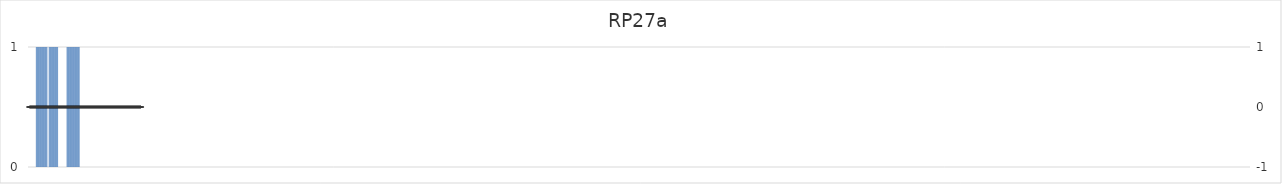
| Category | RP27a |
|---|---|
| 1.0 | 0 |
| 2.0 | 0 |
| 3.0 | 0 |
| 4.0 | 0 |
| 5.0 | 0 |
| 6.0 | 0 |
| 7.0 | 0 |
| 8.0 | 0 |
| 9.0 | 0 |
| 10.0 | 0 |
| 11.0 | 0 |
| 12.0 | 1 |
| 13.0 | 1 |
| 14.0 | 1 |
| 15.0 | 1 |
| 16.0 | 1 |
| 17.0 | 1 |
| 18.0 | 1 |
| 19.0 | 1 |
| 20.0 | 1 |
| 21.0 | 1 |
| 22.0 | 1 |
| 23.0 | 1 |
| 24.0 | 1 |
| 25.0 | 1 |
| 26.0 | 1 |
| 27.0 | 1 |
| 28.0 | 0 |
| 29.0 | 0 |
| 30.0 | 1 |
| 31.0 | 1 |
| 32.0 | 1 |
| 33.0 | 1 |
| 34.0 | 1 |
| 35.0 | 1 |
| 36.0 | 1 |
| 37.0 | 1 |
| 38.0 | 1 |
| 39.0 | 1 |
| 40.0 | 1 |
| 41.0 | 1 |
| 42.0 | 1 |
| 43.0 | 0 |
| 44.0 | 0 |
| 45.0 | 0 |
| 46.0 | 0 |
| 47.0 | 0 |
| 48.0 | 0 |
| 49.0 | 0 |
| 50.0 | 0 |
| 51.0 | 0 |
| 52.0 | 0 |
| 53.0 | 0 |
| 54.0 | 0 |
| 55.0 | 1 |
| 56.0 | 1 |
| 57.0 | 1 |
| 58.0 | 1 |
| 59.0 | 1 |
| 60.0 | 1 |
| 61.0 | 1 |
| 62.0 | 1 |
| 63.0 | 1 |
| 64.0 | 1 |
| 65.0 | 1 |
| 66.0 | 1 |
| 67.0 | 1 |
| 68.0 | 1 |
| 69.0 | 1 |
| 70.0 | 1 |
| 71.0 | 1 |
| 72.0 | 1 |
| 73.0 | 0 |
| 74.0 | 0 |
| 75.0 | 0 |
| 76.0 | 0 |
| 77.0 | 0 |
| 78.0 | 0 |
| 79.0 | 0 |
| 80.0 | 0 |
| 81.0 | 0 |
| 82.0 | 0 |
| 83.0 | 0 |
| 84.0 | 0 |
| 85.0 | 0 |
| 86.0 | 0 |
| 87.0 | 0 |
| 88.0 | 0 |
| 89.0 | 0 |
| 90.0 | 0 |
| 91.0 | 0 |
| 92.0 | 0 |
| 93.0 | 0 |
| 94.0 | 0 |
| 95.0 | 0 |
| 96.0 | 0 |
| 97.0 | 0 |
| 98.0 | 0 |
| 99.0 | 0 |
| 100.0 | 0 |
| 101.0 | 0 |
| 102.0 | 0 |
| 103.0 | 0 |
| 104.0 | 0 |
| 105.0 | 0 |
| 106.0 | 0 |
| 107.0 | 0 |
| 108.0 | 0 |
| 109.0 | 0 |
| 110.0 | 0 |
| 111.0 | 0 |
| 112.0 | 0 |
| 113.0 | 0 |
| 114.0 | 0 |
| 115.0 | 0 |
| 116.0 | 0 |
| 117.0 | 0 |
| 118.0 | 0 |
| 119.0 | 0 |
| 120.0 | 0 |
| 121.0 | 0 |
| 122.0 | 0 |
| 123.0 | 0 |
| 124.0 | 0 |
| 125.0 | 0 |
| 126.0 | 0 |
| 127.0 | 0 |
| 128.0 | 0 |
| 129.0 | 0 |
| 130.0 | 0 |
| 131.0 | 0 |
| 132.0 | 0 |
| 133.0 | 0 |
| 134.0 | 0 |
| 135.0 | 0 |
| 136.0 | 0 |
| 137.0 | 0 |
| 138.0 | 0 |
| 139.0 | 0 |
| 140.0 | 0 |
| 141.0 | 0 |
| 142.0 | 0 |
| 143.0 | 0 |
| 144.0 | 0 |
| 145.0 | 0 |
| 146.0 | 0 |
| 147.0 | 0 |
| 148.0 | 0 |
| 149.0 | 0 |
| 150.0 | 0 |
| 151.0 | 0 |
| 152.0 | 0 |
| 153.0 | 0 |
| 154.0 | 0 |
| 155.0 | 0 |
| 156.0 | 0 |
| 157.0 | 0 |
| 158.0 | 0 |
| 159.0 | 0 |
| 160.0 | 0 |
| 161.0 | 0 |
| 162.0 | 0 |
| 163.0 | 0 |
| 164.0 | 0 |
| 165.0 | 0 |
| 166.0 | 0 |
| 167.0 | 0 |
| 168.0 | 0 |
| 169.0 | 0 |
| 170.0 | 0 |
| 171.0 | 0 |
| 172.0 | 0 |
| 173.0 | 0 |
| 174.0 | 0 |
| 175.0 | 0 |
| 176.0 | 0 |
| 177.0 | 0 |
| 178.0 | 0 |
| 179.0 | 0 |
| 180.0 | 0 |
| 181.0 | 0 |
| 182.0 | 0 |
| 183.0 | 0 |
| 184.0 | 0 |
| 185.0 | 0 |
| 186.0 | 0 |
| 187.0 | 0 |
| 188.0 | 0 |
| 189.0 | 0 |
| 190.0 | 0 |
| 191.0 | 0 |
| 192.0 | 0 |
| 193.0 | 0 |
| 194.0 | 0 |
| 195.0 | 0 |
| 196.0 | 0 |
| 197.0 | 0 |
| 198.0 | 0 |
| 199.0 | 0 |
| 200.0 | 0 |
| 201.0 | 0 |
| 202.0 | 0 |
| 203.0 | 0 |
| 204.0 | 0 |
| 205.0 | 0 |
| 206.0 | 0 |
| 207.0 | 0 |
| 208.0 | 0 |
| 209.0 | 0 |
| 210.0 | 0 |
| 211.0 | 0 |
| 212.0 | 0 |
| 213.0 | 0 |
| 214.0 | 0 |
| 215.0 | 0 |
| 216.0 | 0 |
| 217.0 | 0 |
| 218.0 | 0 |
| 219.0 | 0 |
| 220.0 | 0 |
| 221.0 | 0 |
| 222.0 | 0 |
| 223.0 | 0 |
| 224.0 | 0 |
| 225.0 | 0 |
| 226.0 | 0 |
| 227.0 | 0 |
| 228.0 | 0 |
| 229.0 | 0 |
| 230.0 | 0 |
| 231.0 | 0 |
| 232.0 | 0 |
| 233.0 | 0 |
| 234.0 | 0 |
| 235.0 | 0 |
| 236.0 | 0 |
| 237.0 | 0 |
| 238.0 | 0 |
| 239.0 | 0 |
| 240.0 | 0 |
| 241.0 | 0 |
| 242.0 | 0 |
| 243.0 | 0 |
| 244.0 | 0 |
| 245.0 | 0 |
| 246.0 | 0 |
| 247.0 | 0 |
| 248.0 | 0 |
| 249.0 | 0 |
| 250.0 | 0 |
| 251.0 | 0 |
| 252.0 | 0 |
| 253.0 | 0 |
| 254.0 | 0 |
| 255.0 | 0 |
| 256.0 | 0 |
| 257.0 | 0 |
| 258.0 | 0 |
| 259.0 | 0 |
| 260.0 | 0 |
| 261.0 | 0 |
| 262.0 | 0 |
| 263.0 | 0 |
| 264.0 | 0 |
| 265.0 | 0 |
| 266.0 | 0 |
| 267.0 | 0 |
| 268.0 | 0 |
| 269.0 | 0 |
| 270.0 | 0 |
| 271.0 | 0 |
| 272.0 | 0 |
| 273.0 | 0 |
| 274.0 | 0 |
| 275.0 | 0 |
| 276.0 | 0 |
| 277.0 | 0 |
| 278.0 | 0 |
| 279.0 | 0 |
| 280.0 | 0 |
| 281.0 | 0 |
| 282.0 | 0 |
| 283.0 | 0 |
| 284.0 | 0 |
| 285.0 | 0 |
| 286.0 | 0 |
| 287.0 | 0 |
| 288.0 | 0 |
| 289.0 | 0 |
| 290.0 | 0 |
| 291.0 | 0 |
| 292.0 | 0 |
| 293.0 | 0 |
| 294.0 | 0 |
| 295.0 | 0 |
| 296.0 | 0 |
| 297.0 | 0 |
| 298.0 | 0 |
| 299.0 | 0 |
| 300.0 | 0 |
| 301.0 | 0 |
| 302.0 | 0 |
| 303.0 | 0 |
| 304.0 | 0 |
| 305.0 | 0 |
| 306.0 | 0 |
| 307.0 | 0 |
| 308.0 | 0 |
| 309.0 | 0 |
| 310.0 | 0 |
| 311.0 | 0 |
| 312.0 | 0 |
| 313.0 | 0 |
| 314.0 | 0 |
| 315.0 | 0 |
| 316.0 | 0 |
| 317.0 | 0 |
| 318.0 | 0 |
| 319.0 | 0 |
| 320.0 | 0 |
| 321.0 | 0 |
| 322.0 | 0 |
| 323.0 | 0 |
| 324.0 | 0 |
| 325.0 | 0 |
| 326.0 | 0 |
| 327.0 | 0 |
| 328.0 | 0 |
| 329.0 | 0 |
| 330.0 | 0 |
| 331.0 | 0 |
| 332.0 | 0 |
| 333.0 | 0 |
| 334.0 | 0 |
| 335.0 | 0 |
| 336.0 | 0 |
| 337.0 | 0 |
| 338.0 | 0 |
| 339.0 | 0 |
| 340.0 | 0 |
| 341.0 | 0 |
| 342.0 | 0 |
| 343.0 | 0 |
| 344.0 | 0 |
| 345.0 | 0 |
| 346.0 | 0 |
| 347.0 | 0 |
| 348.0 | 0 |
| 349.0 | 0 |
| 350.0 | 0 |
| 351.0 | 0 |
| 352.0 | 0 |
| 353.0 | 0 |
| 354.0 | 0 |
| 355.0 | 0 |
| 356.0 | 0 |
| 357.0 | 0 |
| 358.0 | 0 |
| 359.0 | 0 |
| 360.0 | 0 |
| 361.0 | 0 |
| 362.0 | 0 |
| 363.0 | 0 |
| 364.0 | 0 |
| 365.0 | 0 |
| 366.0 | 0 |
| 367.0 | 0 |
| 368.0 | 0 |
| 369.0 | 0 |
| 370.0 | 0 |
| 371.0 | 0 |
| 372.0 | 0 |
| 373.0 | 0 |
| 374.0 | 0 |
| 375.0 | 0 |
| 376.0 | 0 |
| 377.0 | 0 |
| 378.0 | 0 |
| 379.0 | 0 |
| 380.0 | 0 |
| 381.0 | 0 |
| 382.0 | 0 |
| 383.0 | 0 |
| 384.0 | 0 |
| 385.0 | 0 |
| 386.0 | 0 |
| 387.0 | 0 |
| 388.0 | 0 |
| 389.0 | 0 |
| 390.0 | 0 |
| 391.0 | 0 |
| 392.0 | 0 |
| 393.0 | 0 |
| 394.0 | 0 |
| 395.0 | 0 |
| 396.0 | 0 |
| 397.0 | 0 |
| 398.0 | 0 |
| 399.0 | 0 |
| 400.0 | 0 |
| 401.0 | 0 |
| 402.0 | 0 |
| 403.0 | 0 |
| 404.0 | 0 |
| 405.0 | 0 |
| 406.0 | 0 |
| 407.0 | 0 |
| 408.0 | 0 |
| 409.0 | 0 |
| 410.0 | 0 |
| 411.0 | 0 |
| 412.0 | 0 |
| 413.0 | 0 |
| 414.0 | 0 |
| 415.0 | 0 |
| 416.0 | 0 |
| 417.0 | 0 |
| 418.0 | 0 |
| 419.0 | 0 |
| 420.0 | 0 |
| 421.0 | 0 |
| 422.0 | 0 |
| 423.0 | 0 |
| 424.0 | 0 |
| 425.0 | 0 |
| 426.0 | 0 |
| 427.0 | 0 |
| 428.0 | 0 |
| 429.0 | 0 |
| 430.0 | 0 |
| 431.0 | 0 |
| 432.0 | 0 |
| 433.0 | 0 |
| 434.0 | 0 |
| 435.0 | 0 |
| 436.0 | 0 |
| 437.0 | 0 |
| 438.0 | 0 |
| 439.0 | 0 |
| 440.0 | 0 |
| 441.0 | 0 |
| 442.0 | 0 |
| 443.0 | 0 |
| 444.0 | 0 |
| 445.0 | 0 |
| 446.0 | 0 |
| 447.0 | 0 |
| 448.0 | 0 |
| 449.0 | 0 |
| 450.0 | 0 |
| 451.0 | 0 |
| 452.0 | 0 |
| 453.0 | 0 |
| 454.0 | 0 |
| 455.0 | 0 |
| 456.0 | 0 |
| 457.0 | 0 |
| 458.0 | 0 |
| 459.0 | 0 |
| 460.0 | 0 |
| 461.0 | 0 |
| 462.0 | 0 |
| 463.0 | 0 |
| 464.0 | 0 |
| 465.0 | 0 |
| 466.0 | 0 |
| 467.0 | 0 |
| 468.0 | 0 |
| 469.0 | 0 |
| 470.0 | 0 |
| 471.0 | 0 |
| 472.0 | 0 |
| 473.0 | 0 |
| 474.0 | 0 |
| 475.0 | 0 |
| 476.0 | 0 |
| 477.0 | 0 |
| 478.0 | 0 |
| 479.0 | 0 |
| 480.0 | 0 |
| 481.0 | 0 |
| 482.0 | 0 |
| 483.0 | 0 |
| 484.0 | 0 |
| 485.0 | 0 |
| 486.0 | 0 |
| 487.0 | 0 |
| 488.0 | 0 |
| 489.0 | 0 |
| 490.0 | 0 |
| 491.0 | 0 |
| 492.0 | 0 |
| 493.0 | 0 |
| 494.0 | 0 |
| 495.0 | 0 |
| 496.0 | 0 |
| 497.0 | 0 |
| 498.0 | 0 |
| 499.0 | 0 |
| 500.0 | 0 |
| 501.0 | 0 |
| 502.0 | 0 |
| 503.0 | 0 |
| 504.0 | 0 |
| 505.0 | 0 |
| 506.0 | 0 |
| 507.0 | 0 |
| 508.0 | 0 |
| 509.0 | 0 |
| 510.0 | 0 |
| 511.0 | 0 |
| 512.0 | 0 |
| 513.0 | 0 |
| 514.0 | 0 |
| 515.0 | 0 |
| 516.0 | 0 |
| 517.0 | 0 |
| 518.0 | 0 |
| 519.0 | 0 |
| 520.0 | 0 |
| 521.0 | 0 |
| 522.0 | 0 |
| 523.0 | 0 |
| 524.0 | 0 |
| 525.0 | 0 |
| 526.0 | 0 |
| 527.0 | 0 |
| 528.0 | 0 |
| 529.0 | 0 |
| 530.0 | 0 |
| 531.0 | 0 |
| 532.0 | 0 |
| 533.0 | 0 |
| 534.0 | 0 |
| 535.0 | 0 |
| 536.0 | 0 |
| 537.0 | 0 |
| 538.0 | 0 |
| 539.0 | 0 |
| 540.0 | 0 |
| 541.0 | 0 |
| 542.0 | 0 |
| 543.0 | 0 |
| 544.0 | 0 |
| 545.0 | 0 |
| 546.0 | 0 |
| 547.0 | 0 |
| 548.0 | 0 |
| 549.0 | 0 |
| 550.0 | 0 |
| 551.0 | 0 |
| 552.0 | 0 |
| 553.0 | 0 |
| 554.0 | 0 |
| 555.0 | 0 |
| 556.0 | 0 |
| 557.0 | 0 |
| 558.0 | 0 |
| 559.0 | 0 |
| 560.0 | 0 |
| 561.0 | 0 |
| 562.0 | 0 |
| 563.0 | 0 |
| 564.0 | 0 |
| 565.0 | 0 |
| 566.0 | 0 |
| 567.0 | 0 |
| 568.0 | 0 |
| 569.0 | 0 |
| 570.0 | 0 |
| 571.0 | 0 |
| 572.0 | 0 |
| 573.0 | 0 |
| 574.0 | 0 |
| 575.0 | 0 |
| 576.0 | 0 |
| 577.0 | 0 |
| 578.0 | 0 |
| 579.0 | 0 |
| 580.0 | 0 |
| 581.0 | 0 |
| 582.0 | 0 |
| 583.0 | 0 |
| 584.0 | 0 |
| 585.0 | 0 |
| 586.0 | 0 |
| 587.0 | 0 |
| 588.0 | 0 |
| 589.0 | 0 |
| 590.0 | 0 |
| 591.0 | 0 |
| 592.0 | 0 |
| 593.0 | 0 |
| 594.0 | 0 |
| 595.0 | 0 |
| 596.0 | 0 |
| 597.0 | 0 |
| 598.0 | 0 |
| 599.0 | 0 |
| 600.0 | 0 |
| 601.0 | 0 |
| 602.0 | 0 |
| 603.0 | 0 |
| 604.0 | 0 |
| 605.0 | 0 |
| 606.0 | 0 |
| 607.0 | 0 |
| 608.0 | 0 |
| 609.0 | 0 |
| 610.0 | 0 |
| 611.0 | 0 |
| 612.0 | 0 |
| 613.0 | 0 |
| 614.0 | 0 |
| 615.0 | 0 |
| 616.0 | 0 |
| 617.0 | 0 |
| 618.0 | 0 |
| 619.0 | 0 |
| 620.0 | 0 |
| 621.0 | 0 |
| 622.0 | 0 |
| 623.0 | 0 |
| 624.0 | 0 |
| 625.0 | 0 |
| 626.0 | 0 |
| 627.0 | 0 |
| 628.0 | 0 |
| 629.0 | 0 |
| 630.0 | 0 |
| 631.0 | 0 |
| 632.0 | 0 |
| 633.0 | 0 |
| 634.0 | 0 |
| 635.0 | 0 |
| 636.0 | 0 |
| 637.0 | 0 |
| 638.0 | 0 |
| 639.0 | 0 |
| 640.0 | 0 |
| 641.0 | 0 |
| 642.0 | 0 |
| 643.0 | 0 |
| 644.0 | 0 |
| 645.0 | 0 |
| 646.0 | 0 |
| 647.0 | 0 |
| 648.0 | 0 |
| 649.0 | 0 |
| 650.0 | 0 |
| 651.0 | 0 |
| 652.0 | 0 |
| 653.0 | 0 |
| 654.0 | 0 |
| 655.0 | 0 |
| 656.0 | 0 |
| 657.0 | 0 |
| 658.0 | 0 |
| 659.0 | 0 |
| 660.0 | 0 |
| 661.0 | 0 |
| 662.0 | 0 |
| 663.0 | 0 |
| 664.0 | 0 |
| 665.0 | 0 |
| 666.0 | 0 |
| 667.0 | 0 |
| 668.0 | 0 |
| 669.0 | 0 |
| 670.0 | 0 |
| 671.0 | 0 |
| 672.0 | 0 |
| 673.0 | 0 |
| 674.0 | 0 |
| 675.0 | 0 |
| 676.0 | 0 |
| 677.0 | 0 |
| 678.0 | 0 |
| 679.0 | 0 |
| 680.0 | 0 |
| 681.0 | 0 |
| 682.0 | 0 |
| 683.0 | 0 |
| 684.0 | 0 |
| 685.0 | 0 |
| 686.0 | 0 |
| 687.0 | 0 |
| 688.0 | 0 |
| 689.0 | 0 |
| 690.0 | 0 |
| 691.0 | 0 |
| 692.0 | 0 |
| 693.0 | 0 |
| 694.0 | 0 |
| 695.0 | 0 |
| 696.0 | 0 |
| 697.0 | 0 |
| 698.0 | 0 |
| 699.0 | 0 |
| 700.0 | 0 |
| 701.0 | 0 |
| 702.0 | 0 |
| 703.0 | 0 |
| 704.0 | 0 |
| 705.0 | 0 |
| 706.0 | 0 |
| 707.0 | 0 |
| 708.0 | 0 |
| 709.0 | 0 |
| 710.0 | 0 |
| 711.0 | 0 |
| 712.0 | 0 |
| 713.0 | 0 |
| 714.0 | 0 |
| 715.0 | 0 |
| 716.0 | 0 |
| 717.0 | 0 |
| 718.0 | 0 |
| 719.0 | 0 |
| 720.0 | 0 |
| 721.0 | 0 |
| 722.0 | 0 |
| 723.0 | 0 |
| 724.0 | 0 |
| 725.0 | 0 |
| 726.0 | 0 |
| 727.0 | 0 |
| 728.0 | 0 |
| 729.0 | 0 |
| 730.0 | 0 |
| 731.0 | 0 |
| 732.0 | 0 |
| 733.0 | 0 |
| 734.0 | 0 |
| 735.0 | 0 |
| 736.0 | 0 |
| 737.0 | 0 |
| 738.0 | 0 |
| 739.0 | 0 |
| 740.0 | 0 |
| 741.0 | 0 |
| 742.0 | 0 |
| 743.0 | 0 |
| 744.0 | 0 |
| 745.0 | 0 |
| 746.0 | 0 |
| 747.0 | 0 |
| 748.0 | 0 |
| 749.0 | 0 |
| 750.0 | 0 |
| 751.0 | 0 |
| 752.0 | 0 |
| 753.0 | 0 |
| 754.0 | 0 |
| 755.0 | 0 |
| 756.0 | 0 |
| 757.0 | 0 |
| 758.0 | 0 |
| 759.0 | 0 |
| 760.0 | 0 |
| 761.0 | 0 |
| 762.0 | 0 |
| 763.0 | 0 |
| 764.0 | 0 |
| 765.0 | 0 |
| 766.0 | 0 |
| 767.0 | 0 |
| 768.0 | 0 |
| 769.0 | 0 |
| 770.0 | 0 |
| 771.0 | 0 |
| 772.0 | 0 |
| 773.0 | 0 |
| 774.0 | 0 |
| 775.0 | 0 |
| 776.0 | 0 |
| 777.0 | 0 |
| 778.0 | 0 |
| 779.0 | 0 |
| 780.0 | 0 |
| 781.0 | 0 |
| 782.0 | 0 |
| 783.0 | 0 |
| 784.0 | 0 |
| 785.0 | 0 |
| 786.0 | 0 |
| 787.0 | 0 |
| 788.0 | 0 |
| 789.0 | 0 |
| 790.0 | 0 |
| 791.0 | 0 |
| 792.0 | 0 |
| 793.0 | 0 |
| 794.0 | 0 |
| 795.0 | 0 |
| 796.0 | 0 |
| 797.0 | 0 |
| 798.0 | 0 |
| 799.0 | 0 |
| 800.0 | 0 |
| 801.0 | 0 |
| 802.0 | 0 |
| 803.0 | 0 |
| 804.0 | 0 |
| 805.0 | 0 |
| 806.0 | 0 |
| 807.0 | 0 |
| 808.0 | 0 |
| 809.0 | 0 |
| 810.0 | 0 |
| 811.0 | 0 |
| 812.0 | 0 |
| 813.0 | 0 |
| 814.0 | 0 |
| 815.0 | 0 |
| 816.0 | 0 |
| 817.0 | 0 |
| 818.0 | 0 |
| 819.0 | 0 |
| 820.0 | 0 |
| 821.0 | 0 |
| 822.0 | 0 |
| 823.0 | 0 |
| 824.0 | 0 |
| 825.0 | 0 |
| 826.0 | 0 |
| 827.0 | 0 |
| 828.0 | 0 |
| 829.0 | 0 |
| 830.0 | 0 |
| 831.0 | 0 |
| 832.0 | 0 |
| 833.0 | 0 |
| 834.0 | 0 |
| 835.0 | 0 |
| 836.0 | 0 |
| 837.0 | 0 |
| 838.0 | 0 |
| 839.0 | 0 |
| 840.0 | 0 |
| 841.0 | 0 |
| 842.0 | 0 |
| 843.0 | 0 |
| 844.0 | 0 |
| 845.0 | 0 |
| 846.0 | 0 |
| 847.0 | 0 |
| 848.0 | 0 |
| 849.0 | 0 |
| 850.0 | 0 |
| 851.0 | 0 |
| 852.0 | 0 |
| 853.0 | 0 |
| 854.0 | 0 |
| 855.0 | 0 |
| 856.0 | 0 |
| 857.0 | 0 |
| 858.0 | 0 |
| 859.0 | 0 |
| 860.0 | 0 |
| 861.0 | 0 |
| 862.0 | 0 |
| 863.0 | 0 |
| 864.0 | 0 |
| 865.0 | 0 |
| 866.0 | 0 |
| 867.0 | 0 |
| 868.0 | 0 |
| 869.0 | 0 |
| 870.0 | 0 |
| 871.0 | 0 |
| 872.0 | 0 |
| 873.0 | 0 |
| 874.0 | 0 |
| 875.0 | 0 |
| 876.0 | 0 |
| 877.0 | 0 |
| 878.0 | 0 |
| 879.0 | 0 |
| 880.0 | 0 |
| 881.0 | 0 |
| 882.0 | 0 |
| 883.0 | 0 |
| 884.0 | 0 |
| 885.0 | 0 |
| 886.0 | 0 |
| 887.0 | 0 |
| 888.0 | 0 |
| 889.0 | 0 |
| 890.0 | 0 |
| 891.0 | 0 |
| 892.0 | 0 |
| 893.0 | 0 |
| 894.0 | 0 |
| 895.0 | 0 |
| 896.0 | 0 |
| 897.0 | 0 |
| 898.0 | 0 |
| 899.0 | 0 |
| 900.0 | 0 |
| 901.0 | 0 |
| 902.0 | 0 |
| 903.0 | 0 |
| 904.0 | 0 |
| 905.0 | 0 |
| 906.0 | 0 |
| 907.0 | 0 |
| 908.0 | 0 |
| 909.0 | 0 |
| 910.0 | 0 |
| 911.0 | 0 |
| 912.0 | 0 |
| 913.0 | 0 |
| 914.0 | 0 |
| 915.0 | 0 |
| 916.0 | 0 |
| 917.0 | 0 |
| 918.0 | 0 |
| 919.0 | 0 |
| 920.0 | 0 |
| 921.0 | 0 |
| 922.0 | 0 |
| 923.0 | 0 |
| 924.0 | 0 |
| 925.0 | 0 |
| 926.0 | 0 |
| 927.0 | 0 |
| 928.0 | 0 |
| 929.0 | 0 |
| 930.0 | 0 |
| 931.0 | 0 |
| 932.0 | 0 |
| 933.0 | 0 |
| 934.0 | 0 |
| 935.0 | 0 |
| 936.0 | 0 |
| 937.0 | 0 |
| 938.0 | 0 |
| 939.0 | 0 |
| 940.0 | 0 |
| 941.0 | 0 |
| 942.0 | 0 |
| 943.0 | 0 |
| 944.0 | 0 |
| 945.0 | 0 |
| 946.0 | 0 |
| 947.0 | 0 |
| 948.0 | 0 |
| 949.0 | 0 |
| 950.0 | 0 |
| 951.0 | 0 |
| 952.0 | 0 |
| 953.0 | 0 |
| 954.0 | 0 |
| 955.0 | 0 |
| 956.0 | 0 |
| 957.0 | 0 |
| 958.0 | 0 |
| 959.0 | 0 |
| 960.0 | 0 |
| 961.0 | 0 |
| 962.0 | 0 |
| 963.0 | 0 |
| 964.0 | 0 |
| 965.0 | 0 |
| 966.0 | 0 |
| 967.0 | 0 |
| 968.0 | 0 |
| 969.0 | 0 |
| 970.0 | 0 |
| 971.0 | 0 |
| 972.0 | 0 |
| 973.0 | 0 |
| 974.0 | 0 |
| 975.0 | 0 |
| 976.0 | 0 |
| 977.0 | 0 |
| 978.0 | 0 |
| 979.0 | 0 |
| 980.0 | 0 |
| 981.0 | 0 |
| 982.0 | 0 |
| 983.0 | 0 |
| 984.0 | 0 |
| 985.0 | 0 |
| 986.0 | 0 |
| 987.0 | 0 |
| 988.0 | 0 |
| 989.0 | 0 |
| 990.0 | 0 |
| 991.0 | 0 |
| 992.0 | 0 |
| 993.0 | 0 |
| 994.0 | 0 |
| 995.0 | 0 |
| 996.0 | 0 |
| 997.0 | 0 |
| 998.0 | 0 |
| 999.0 | 0 |
| 1000.0 | 0 |
| 1001.0 | 0 |
| 1002.0 | 0 |
| 1003.0 | 0 |
| 1004.0 | 0 |
| 1005.0 | 0 |
| 1006.0 | 0 |
| 1007.0 | 0 |
| 1008.0 | 0 |
| 1009.0 | 0 |
| 1010.0 | 0 |
| 1011.0 | 0 |
| 1012.0 | 0 |
| 1013.0 | 0 |
| 1014.0 | 0 |
| 1015.0 | 0 |
| 1016.0 | 0 |
| 1017.0 | 0 |
| 1018.0 | 0 |
| 1019.0 | 0 |
| 1020.0 | 0 |
| 1021.0 | 0 |
| 1022.0 | 0 |
| 1023.0 | 0 |
| 1024.0 | 0 |
| 1025.0 | 0 |
| 1026.0 | 0 |
| 1027.0 | 0 |
| 1028.0 | 0 |
| 1029.0 | 0 |
| 1030.0 | 0 |
| 1031.0 | 0 |
| 1032.0 | 0 |
| 1033.0 | 0 |
| 1034.0 | 0 |
| 1035.0 | 0 |
| 1036.0 | 0 |
| 1037.0 | 0 |
| 1038.0 | 0 |
| 1039.0 | 0 |
| 1040.0 | 0 |
| 1041.0 | 0 |
| 1042.0 | 0 |
| 1043.0 | 0 |
| 1044.0 | 0 |
| 1045.0 | 0 |
| 1046.0 | 0 |
| 1047.0 | 0 |
| 1048.0 | 0 |
| 1049.0 | 0 |
| 1050.0 | 0 |
| 1051.0 | 0 |
| 1052.0 | 0 |
| 1053.0 | 0 |
| 1054.0 | 0 |
| 1055.0 | 0 |
| 1056.0 | 0 |
| 1057.0 | 0 |
| 1058.0 | 0 |
| 1059.0 | 0 |
| 1060.0 | 0 |
| 1061.0 | 0 |
| 1062.0 | 0 |
| 1063.0 | 0 |
| 1064.0 | 0 |
| 1065.0 | 0 |
| 1066.0 | 0 |
| 1067.0 | 0 |
| 1068.0 | 0 |
| 1069.0 | 0 |
| 1070.0 | 0 |
| 1071.0 | 0 |
| 1072.0 | 0 |
| 1073.0 | 0 |
| 1074.0 | 0 |
| 1075.0 | 0 |
| 1076.0 | 0 |
| 1077.0 | 0 |
| 1078.0 | 0 |
| 1079.0 | 0 |
| 1080.0 | 0 |
| 1081.0 | 0 |
| 1082.0 | 0 |
| 1083.0 | 0 |
| 1084.0 | 0 |
| 1085.0 | 0 |
| 1086.0 | 0 |
| 1087.0 | 0 |
| 1088.0 | 0 |
| 1089.0 | 0 |
| 1090.0 | 0 |
| 1091.0 | 0 |
| 1092.0 | 0 |
| 1093.0 | 0 |
| 1094.0 | 0 |
| 1095.0 | 0 |
| 1096.0 | 0 |
| 1097.0 | 0 |
| 1098.0 | 0 |
| 1099.0 | 0 |
| 1100.0 | 0 |
| 1101.0 | 0 |
| 1102.0 | 0 |
| 1103.0 | 0 |
| 1104.0 | 0 |
| 1105.0 | 0 |
| 1106.0 | 0 |
| 1107.0 | 0 |
| 1108.0 | 0 |
| 1109.0 | 0 |
| 1110.0 | 0 |
| 1111.0 | 0 |
| 1112.0 | 0 |
| 1113.0 | 0 |
| 1114.0 | 0 |
| 1115.0 | 0 |
| 1116.0 | 0 |
| 1117.0 | 0 |
| 1118.0 | 0 |
| 1119.0 | 0 |
| 1120.0 | 0 |
| 1121.0 | 0 |
| 1122.0 | 0 |
| 1123.0 | 0 |
| 1124.0 | 0 |
| 1125.0 | 0 |
| 1126.0 | 0 |
| 1127.0 | 0 |
| 1128.0 | 0 |
| 1129.0 | 0 |
| 1130.0 | 0 |
| 1131.0 | 0 |
| 1132.0 | 0 |
| 1133.0 | 0 |
| 1134.0 | 0 |
| 1135.0 | 0 |
| 1136.0 | 0 |
| 1137.0 | 0 |
| 1138.0 | 0 |
| 1139.0 | 0 |
| 1140.0 | 0 |
| 1141.0 | 0 |
| 1142.0 | 0 |
| 1143.0 | 0 |
| 1144.0 | 0 |
| 1145.0 | 0 |
| 1146.0 | 0 |
| 1147.0 | 0 |
| 1148.0 | 0 |
| 1149.0 | 0 |
| 1150.0 | 0 |
| 1151.0 | 0 |
| 1152.0 | 0 |
| 1153.0 | 0 |
| 1154.0 | 0 |
| 1155.0 | 0 |
| 1156.0 | 0 |
| 1157.0 | 0 |
| 1158.0 | 0 |
| 1159.0 | 0 |
| 1160.0 | 0 |
| 1161.0 | 0 |
| 1162.0 | 0 |
| 1163.0 | 0 |
| 1164.0 | 0 |
| 1165.0 | 0 |
| 1166.0 | 0 |
| 1167.0 | 0 |
| 1168.0 | 0 |
| 1169.0 | 0 |
| 1170.0 | 0 |
| 1171.0 | 0 |
| 1172.0 | 0 |
| 1173.0 | 0 |
| 1174.0 | 0 |
| 1175.0 | 0 |
| 1176.0 | 0 |
| 1177.0 | 0 |
| 1178.0 | 0 |
| 1179.0 | 0 |
| 1180.0 | 0 |
| 1181.0 | 0 |
| 1182.0 | 0 |
| 1183.0 | 0 |
| 1184.0 | 0 |
| 1185.0 | 0 |
| 1186.0 | 0 |
| 1187.0 | 0 |
| 1188.0 | 0 |
| 1189.0 | 0 |
| 1190.0 | 0 |
| 1191.0 | 0 |
| 1192.0 | 0 |
| 1193.0 | 0 |
| 1194.0 | 0 |
| 1195.0 | 0 |
| 1196.0 | 0 |
| 1197.0 | 0 |
| 1198.0 | 0 |
| 1199.0 | 0 |
| 1200.0 | 0 |
| 1201.0 | 0 |
| 1202.0 | 0 |
| 1203.0 | 0 |
| 1204.0 | 0 |
| 1205.0 | 0 |
| 1206.0 | 0 |
| 1207.0 | 0 |
| 1208.0 | 0 |
| 1209.0 | 0 |
| 1210.0 | 0 |
| 1211.0 | 0 |
| 1212.0 | 0 |
| 1213.0 | 0 |
| 1214.0 | 0 |
| 1215.0 | 0 |
| 1216.0 | 0 |
| 1217.0 | 0 |
| 1218.0 | 0 |
| 1219.0 | 0 |
| 1220.0 | 0 |
| 1221.0 | 0 |
| 1222.0 | 0 |
| 1223.0 | 0 |
| 1224.0 | 0 |
| 1225.0 | 0 |
| 1226.0 | 0 |
| 1227.0 | 0 |
| 1228.0 | 0 |
| 1229.0 | 0 |
| 1230.0 | 0 |
| 1231.0 | 0 |
| 1232.0 | 0 |
| 1233.0 | 0 |
| 1234.0 | 0 |
| 1235.0 | 0 |
| 1236.0 | 0 |
| 1237.0 | 0 |
| 1238.0 | 0 |
| 1239.0 | 0 |
| 1240.0 | 0 |
| 1241.0 | 0 |
| 1242.0 | 0 |
| 1243.0 | 0 |
| 1244.0 | 0 |
| 1245.0 | 0 |
| 1246.0 | 0 |
| 1247.0 | 0 |
| 1248.0 | 0 |
| 1249.0 | 0 |
| 1250.0 | 0 |
| 1251.0 | 0 |
| 1252.0 | 0 |
| 1253.0 | 0 |
| 1254.0 | 0 |
| 1255.0 | 0 |
| 1256.0 | 0 |
| 1257.0 | 0 |
| 1258.0 | 0 |
| 1259.0 | 0 |
| 1260.0 | 0 |
| 1261.0 | 0 |
| 1262.0 | 0 |
| 1263.0 | 0 |
| 1264.0 | 0 |
| 1265.0 | 0 |
| 1266.0 | 0 |
| 1267.0 | 0 |
| 1268.0 | 0 |
| 1269.0 | 0 |
| 1270.0 | 0 |
| 1271.0 | 0 |
| 1272.0 | 0 |
| 1273.0 | 0 |
| 1274.0 | 0 |
| 1275.0 | 0 |
| 1276.0 | 0 |
| 1277.0 | 0 |
| 1278.0 | 0 |
| 1279.0 | 0 |
| 1280.0 | 0 |
| 1281.0 | 0 |
| 1282.0 | 0 |
| 1283.0 | 0 |
| 1284.0 | 0 |
| 1285.0 | 0 |
| 1286.0 | 0 |
| 1287.0 | 0 |
| 1288.0 | 0 |
| 1289.0 | 0 |
| 1290.0 | 0 |
| 1291.0 | 0 |
| 1292.0 | 0 |
| 1293.0 | 0 |
| 1294.0 | 0 |
| 1295.0 | 0 |
| 1296.0 | 0 |
| 1297.0 | 0 |
| 1298.0 | 0 |
| 1299.0 | 0 |
| 1300.0 | 0 |
| 1301.0 | 0 |
| 1302.0 | 0 |
| 1303.0 | 0 |
| 1304.0 | 0 |
| 1305.0 | 0 |
| 1306.0 | 0 |
| 1307.0 | 0 |
| 1308.0 | 0 |
| 1309.0 | 0 |
| 1310.0 | 0 |
| 1311.0 | 0 |
| 1312.0 | 0 |
| 1313.0 | 0 |
| 1314.0 | 0 |
| 1315.0 | 0 |
| 1316.0 | 0 |
| 1317.0 | 0 |
| 1318.0 | 0 |
| 1319.0 | 0 |
| 1320.0 | 0 |
| 1321.0 | 0 |
| 1322.0 | 0 |
| 1323.0 | 0 |
| 1324.0 | 0 |
| 1325.0 | 0 |
| 1326.0 | 0 |
| 1327.0 | 0 |
| 1328.0 | 0 |
| 1329.0 | 0 |
| 1330.0 | 0 |
| 1331.0 | 0 |
| 1332.0 | 0 |
| 1333.0 | 0 |
| 1334.0 | 0 |
| 1335.0 | 0 |
| 1336.0 | 0 |
| 1337.0 | 0 |
| 1338.0 | 0 |
| 1339.0 | 0 |
| 1340.0 | 0 |
| 1341.0 | 0 |
| 1342.0 | 0 |
| 1343.0 | 0 |
| 1344.0 | 0 |
| 1345.0 | 0 |
| 1346.0 | 0 |
| 1347.0 | 0 |
| 1348.0 | 0 |
| 1349.0 | 0 |
| 1350.0 | 0 |
| 1351.0 | 0 |
| 1352.0 | 0 |
| 1353.0 | 0 |
| 1354.0 | 0 |
| 1355.0 | 0 |
| 1356.0 | 0 |
| 1357.0 | 0 |
| 1358.0 | 0 |
| 1359.0 | 0 |
| 1360.0 | 0 |
| 1361.0 | 0 |
| 1362.0 | 0 |
| 1363.0 | 0 |
| 1364.0 | 0 |
| 1365.0 | 0 |
| 1366.0 | 0 |
| 1367.0 | 0 |
| 1368.0 | 0 |
| 1369.0 | 0 |
| 1370.0 | 0 |
| 1371.0 | 0 |
| 1372.0 | 0 |
| 1373.0 | 0 |
| 1374.0 | 0 |
| 1375.0 | 0 |
| 1376.0 | 0 |
| 1377.0 | 0 |
| 1378.0 | 0 |
| 1379.0 | 0 |
| 1380.0 | 0 |
| 1381.0 | 0 |
| 1382.0 | 0 |
| 1383.0 | 0 |
| 1384.0 | 0 |
| 1385.0 | 0 |
| 1386.0 | 0 |
| 1387.0 | 0 |
| 1388.0 | 0 |
| 1389.0 | 0 |
| 1390.0 | 0 |
| 1391.0 | 0 |
| 1392.0 | 0 |
| 1393.0 | 0 |
| 1394.0 | 0 |
| 1395.0 | 0 |
| 1396.0 | 0 |
| 1397.0 | 0 |
| 1398.0 | 0 |
| 1399.0 | 0 |
| 1400.0 | 0 |
| 1401.0 | 0 |
| 1402.0 | 0 |
| 1403.0 | 0 |
| 1404.0 | 0 |
| 1405.0 | 0 |
| 1406.0 | 0 |
| 1407.0 | 0 |
| 1408.0 | 0 |
| 1409.0 | 0 |
| 1410.0 | 0 |
| 1411.0 | 0 |
| 1412.0 | 0 |
| 1413.0 | 0 |
| 1414.0 | 0 |
| 1415.0 | 0 |
| 1416.0 | 0 |
| 1417.0 | 0 |
| 1418.0 | 0 |
| 1419.0 | 0 |
| 1420.0 | 0 |
| 1421.0 | 0 |
| 1422.0 | 0 |
| 1423.0 | 0 |
| 1424.0 | 0 |
| 1425.0 | 0 |
| 1426.0 | 0 |
| 1427.0 | 0 |
| 1428.0 | 0 |
| 1429.0 | 0 |
| 1430.0 | 0 |
| 1431.0 | 0 |
| 1432.0 | 0 |
| 1433.0 | 0 |
| 1434.0 | 0 |
| 1435.0 | 0 |
| 1436.0 | 0 |
| 1437.0 | 0 |
| 1438.0 | 0 |
| 1439.0 | 0 |
| 1440.0 | 0 |
| 1441.0 | 0 |
| 1442.0 | 0 |
| 1443.0 | 0 |
| 1444.0 | 0 |
| 1445.0 | 0 |
| 1446.0 | 0 |
| 1447.0 | 0 |
| 1448.0 | 0 |
| 1449.0 | 0 |
| 1450.0 | 0 |
| 1451.0 | 0 |
| 1452.0 | 0 |
| 1453.0 | 0 |
| 1454.0 | 0 |
| 1455.0 | 0 |
| 1456.0 | 0 |
| 1457.0 | 0 |
| 1458.0 | 0 |
| 1459.0 | 0 |
| 1460.0 | 0 |
| 1461.0 | 0 |
| 1462.0 | 0 |
| 1463.0 | 0 |
| 1464.0 | 0 |
| 1465.0 | 0 |
| 1466.0 | 0 |
| 1467.0 | 0 |
| 1468.0 | 0 |
| 1469.0 | 0 |
| 1470.0 | 0 |
| 1471.0 | 0 |
| 1472.0 | 0 |
| 1473.0 | 0 |
| 1474.0 | 0 |
| 1475.0 | 0 |
| 1476.0 | 0 |
| 1477.0 | 0 |
| 1478.0 | 0 |
| 1479.0 | 0 |
| 1480.0 | 0 |
| 1481.0 | 0 |
| 1482.0 | 0 |
| 1483.0 | 0 |
| 1484.0 | 0 |
| 1485.0 | 0 |
| 1486.0 | 0 |
| 1487.0 | 0 |
| 1488.0 | 0 |
| 1489.0 | 0 |
| 1490.0 | 0 |
| 1491.0 | 0 |
| 1492.0 | 0 |
| 1493.0 | 0 |
| 1494.0 | 0 |
| 1495.0 | 0 |
| 1496.0 | 0 |
| 1497.0 | 0 |
| 1498.0 | 0 |
| 1499.0 | 0 |
| 1500.0 | 0 |
| 1501.0 | 0 |
| 1502.0 | 0 |
| 1503.0 | 0 |
| 1504.0 | 0 |
| 1505.0 | 0 |
| 1506.0 | 0 |
| 1507.0 | 0 |
| 1508.0 | 0 |
| 1509.0 | 0 |
| 1510.0 | 0 |
| 1511.0 | 0 |
| 1512.0 | 0 |
| 1513.0 | 0 |
| 1514.0 | 0 |
| 1515.0 | 0 |
| 1516.0 | 0 |
| 1517.0 | 0 |
| 1518.0 | 0 |
| 1519.0 | 0 |
| 1520.0 | 0 |
| 1521.0 | 0 |
| 1522.0 | 0 |
| 1523.0 | 0 |
| 1524.0 | 0 |
| 1525.0 | 0 |
| 1526.0 | 0 |
| 1527.0 | 0 |
| 1528.0 | 0 |
| 1529.0 | 0 |
| 1530.0 | 0 |
| 1531.0 | 0 |
| 1532.0 | 0 |
| 1533.0 | 0 |
| 1534.0 | 0 |
| 1535.0 | 0 |
| 1536.0 | 0 |
| 1537.0 | 0 |
| 1538.0 | 0 |
| 1539.0 | 0 |
| 1540.0 | 0 |
| 1541.0 | 0 |
| 1542.0 | 0 |
| 1543.0 | 0 |
| 1544.0 | 0 |
| 1545.0 | 0 |
| 1546.0 | 0 |
| 1547.0 | 0 |
| 1548.0 | 0 |
| 1549.0 | 0 |
| 1550.0 | 0 |
| 1551.0 | 0 |
| 1552.0 | 0 |
| 1553.0 | 0 |
| 1554.0 | 0 |
| 1555.0 | 0 |
| 1556.0 | 0 |
| 1557.0 | 0 |
| 1558.0 | 0 |
| 1559.0 | 0 |
| 1560.0 | 0 |
| 1561.0 | 0 |
| 1562.0 | 0 |
| 1563.0 | 0 |
| 1564.0 | 0 |
| 1565.0 | 0 |
| 1566.0 | 0 |
| 1567.0 | 0 |
| 1568.0 | 0 |
| 1569.0 | 0 |
| 1570.0 | 0 |
| 1571.0 | 0 |
| 1572.0 | 0 |
| 1573.0 | 0 |
| 1574.0 | 0 |
| 1575.0 | 0 |
| 1576.0 | 0 |
| 1577.0 | 0 |
| 1578.0 | 0 |
| 1579.0 | 0 |
| 1580.0 | 0 |
| 1581.0 | 0 |
| 1582.0 | 0 |
| 1583.0 | 0 |
| 1584.0 | 0 |
| 1585.0 | 0 |
| 1586.0 | 0 |
| 1587.0 | 0 |
| 1588.0 | 0 |
| 1589.0 | 0 |
| 1590.0 | 0 |
| 1591.0 | 0 |
| 1592.0 | 0 |
| 1593.0 | 0 |
| 1594.0 | 0 |
| 1595.0 | 0 |
| 1596.0 | 0 |
| 1597.0 | 0 |
| 1598.0 | 0 |
| 1599.0 | 0 |
| 1600.0 | 0 |
| 1601.0 | 0 |
| 1602.0 | 0 |
| 1603.0 | 0 |
| 1604.0 | 0 |
| 1605.0 | 0 |
| 1606.0 | 0 |
| 1607.0 | 0 |
| 1608.0 | 0 |
| 1609.0 | 0 |
| 1610.0 | 0 |
| 1611.0 | 0 |
| 1612.0 | 0 |
| 1613.0 | 0 |
| 1614.0 | 0 |
| 1615.0 | 0 |
| 1616.0 | 0 |
| 1617.0 | 0 |
| 1618.0 | 0 |
| 1619.0 | 0 |
| 1620.0 | 0 |
| 1621.0 | 0 |
| 1622.0 | 0 |
| 1623.0 | 0 |
| 1624.0 | 0 |
| 1625.0 | 0 |
| 1626.0 | 0 |
| 1627.0 | 0 |
| 1628.0 | 0 |
| 1629.0 | 0 |
| 1630.0 | 0 |
| 1631.0 | 0 |
| 1632.0 | 0 |
| 1633.0 | 0 |
| 1634.0 | 0 |
| 1635.0 | 0 |
| 1636.0 | 0 |
| 1637.0 | 0 |
| 1638.0 | 0 |
| 1639.0 | 0 |
| 1640.0 | 0 |
| 1641.0 | 0 |
| 1642.0 | 0 |
| 1643.0 | 0 |
| 1644.0 | 0 |
| 1645.0 | 0 |
| 1646.0 | 0 |
| 1647.0 | 0 |
| 1648.0 | 0 |
| 1649.0 | 0 |
| 1650.0 | 0 |
| 1651.0 | 0 |
| 1652.0 | 0 |
| 1653.0 | 0 |
| 1654.0 | 0 |
| 1655.0 | 0 |
| 1656.0 | 0 |
| 1657.0 | 0 |
| 1658.0 | 0 |
| 1659.0 | 0 |
| 1660.0 | 0 |
| 1661.0 | 0 |
| 1662.0 | 0 |
| 1663.0 | 0 |
| 1664.0 | 0 |
| 1665.0 | 0 |
| 1666.0 | 0 |
| 1667.0 | 0 |
| 1668.0 | 0 |
| 1669.0 | 0 |
| 1670.0 | 0 |
| 1671.0 | 0 |
| 1672.0 | 0 |
| 1673.0 | 0 |
| 1674.0 | 0 |
| 1675.0 | 0 |
| 1676.0 | 0 |
| 1677.0 | 0 |
| 1678.0 | 0 |
| 1679.0 | 0 |
| 1680.0 | 0 |
| 1681.0 | 0 |
| 1682.0 | 0 |
| 1683.0 | 0 |
| 1684.0 | 0 |
| 1685.0 | 0 |
| 1686.0 | 0 |
| 1687.0 | 0 |
| 1688.0 | 0 |
| 1689.0 | 0 |
| 1690.0 | 0 |
| 1691.0 | 0 |
| 1692.0 | 0 |
| 1693.0 | 0 |
| 1694.0 | 0 |
| 1695.0 | 0 |
| 1696.0 | 0 |
| 1697.0 | 0 |
| 1698.0 | 0 |
| 1699.0 | 0 |
| 1700.0 | 0 |
| 1701.0 | 0 |
| 1702.0 | 0 |
| 1703.0 | 0 |
| 1704.0 | 0 |
| 1705.0 | 0 |
| 1706.0 | 0 |
| 1707.0 | 0 |